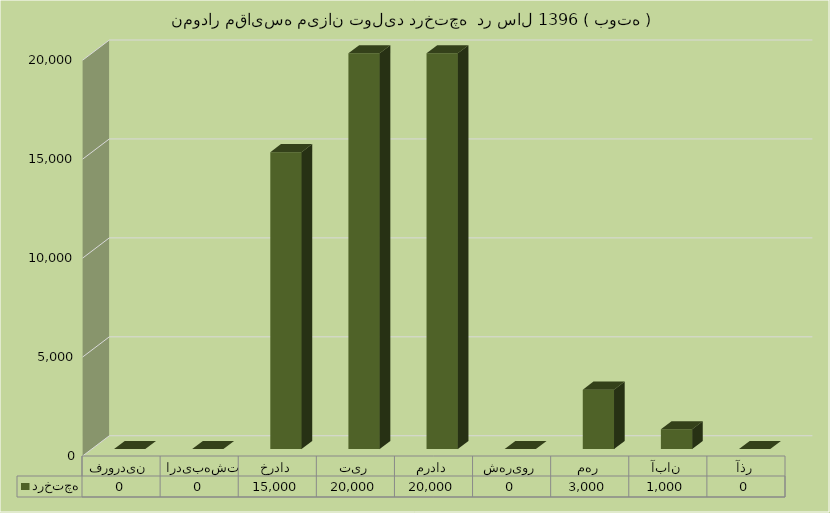
| Category | درختچه |
|---|---|
| فروردین | 0 |
| اردیبهشت | 0 |
| خرداد | 15000 |
| تیر | 20000 |
| مرداد | 20000 |
| شهریور | 0 |
| مهر | 3000 |
| آبان | 1000 |
| آذر | 0 |